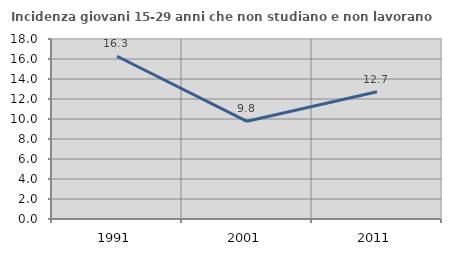
| Category | Incidenza giovani 15-29 anni che non studiano e non lavorano  |
|---|---|
| 1991.0 | 16.273 |
| 2001.0 | 9.771 |
| 2011.0 | 12.731 |